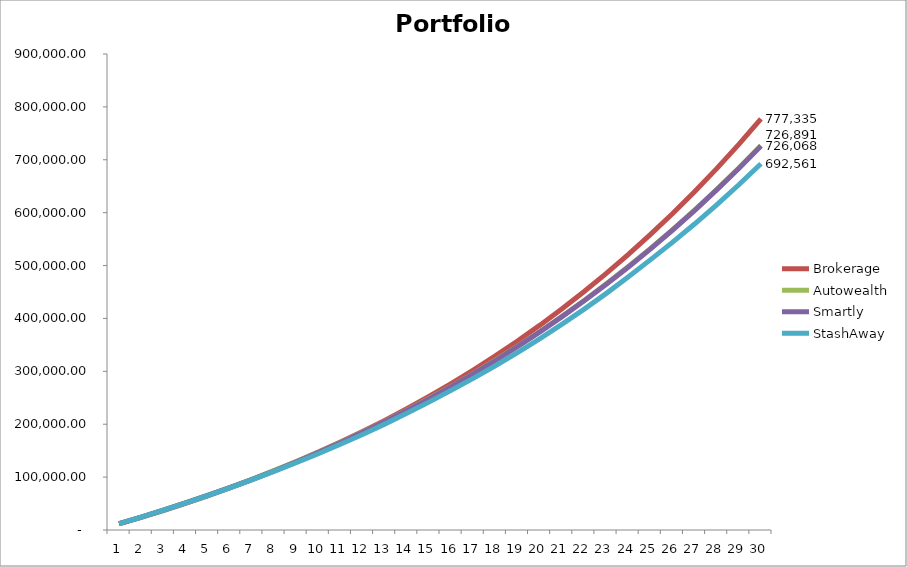
| Category | Brokerage | Autowealth | Smartly | StashAway |
|---|---|---|---|---|
| 0 | 11700 | 11914.8 | 11916 | 11904 |
| 1 | 23985 | 24425.34 | 24427.8 | 24403.2 |
| 2 | 36884.25 | 37498.407 | 37476.99 | 37428.134 |
| 3 | 50428.462 | 51158.977 | 51086.03 | 51012.544 |
| 4 | 64649.886 | 65433.119 | 65278.28 | 65007.096 |
| 5 | 79582.38 | 80348.037 | 80078.041 | 79617.408 |
| 6 | 95261.499 | 95932.124 | 95510.583 | 94870.574 |
| 7 | 111724.574 | 112215.01 | 111602.183 | 110794.88 |
| 8 | 129010.803 | 129227.613 | 128609.346 | 127130.649 |
| 9 | 147161.343 | 147002.2 | 146378.219 | 144201.528 |
| 10 | 166219.41 | 165572.437 | 164942.457 | 162040.597 |
| 11 | 186230.38 | 184973.451 | 184337.172 | 180682.424 |
| 12 | 207241.899 | 205241.896 | 204599.003 | 200163.133 |
| 13 | 229303.994 | 226416.012 | 225766.175 | 220520.474 |
| 14 | 252469.194 | 248535.695 | 247878.565 | 241793.895 |
| 15 | 276792.654 | 271642.566 | 270977.78 | 264024.621 |
| 16 | 302332.286 | 295780.045 | 295107.219 | 286769.753 |
| 17 | 329148.901 | 320993.425 | 320312.158 | 310561.162 |
| 18 | 357306.346 | 347329.953 | 346639.823 | 335446.975 |
| 19 | 386871.663 | 374838.91 | 374139.474 | 361477.536 |
| 20 | 417915.246 | 403571.699 | 402862.491 | 388705.503 |
| 21 | 450511.008 | 433581.929 | 432862.46 | 417185.956 |
| 22 | 484736.559 | 464925.512 | 464195.27 | 446976.51 |
| 23 | 520673.387 | 497660.759 | 496919.205 | 478137.43 |
| 24 | 558407.056 | 531848.477 | 531095.045 | 510731.751 |
| 25 | 598027.409 | 567552.075 | 566786.172 | 543836.144 |
| 26 | 639628.779 | 604837.672 | 604058.673 | 578496.442 |
| 27 | 683310.218 | 643774.208 | 642981.459 | 614785.775 |
| 28 | 729175.729 | 684433.563 | 683626.377 | 652780.707 |
| 29 | 777334.516 | 726890.679 | 726068.333 | 692561.4 |